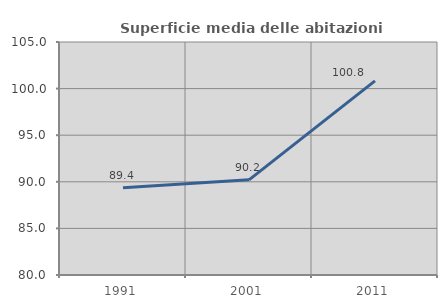
| Category | Superficie media delle abitazioni occupate |
|---|---|
| 1991.0 | 89.354 |
| 2001.0 | 90.213 |
| 2011.0 | 100.833 |